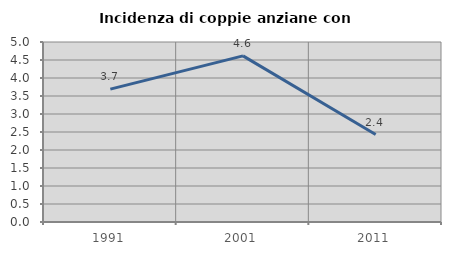
| Category | Incidenza di coppie anziane con figli |
|---|---|
| 1991.0 | 3.69 |
| 2001.0 | 4.615 |
| 2011.0 | 2.429 |